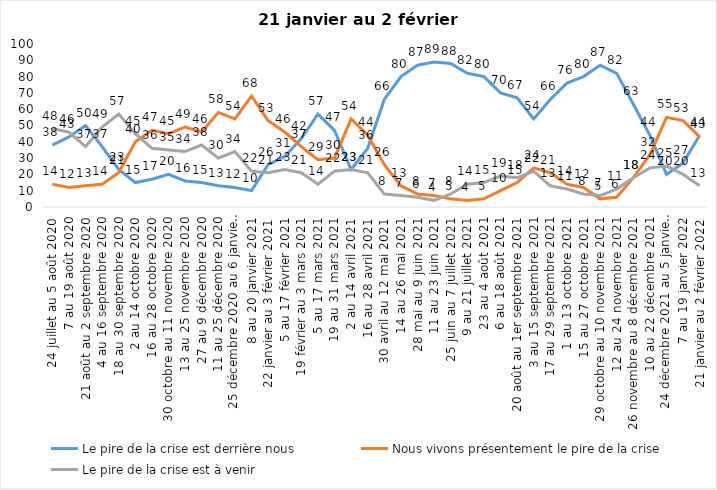
| Category | Le pire de la crise est derrière nous | Nous vivons présentement le pire de la crise | Le pire de la crise est à venir |
|---|---|---|---|
| 24 juillet au 5 août 2020 | 38 | 14 | 48 |
| 7 au 19 août 2020 | 43 | 12 | 46 |
| 21 août au 2 septembre 2020 | 50 | 13 | 37 |
| 4 au 16 septembre 2020 | 37 | 14 | 49 |
| 18 au 30 septembre 2020 | 23 | 21 | 57 |
| 2 au 14 octobre 2020 | 15 | 40 | 45 |
| 16 au 28 octobre 2020 | 17 | 47 | 36 |
| 30 octobre au 11 novembre 2020 | 20 | 45 | 35 |
| 13 au 25 novembre 2020 | 16 | 49 | 34 |
| 27 au 9 décembre 2020 | 15 | 46 | 38 |
| 11 au 25 décembre 2020 | 13 | 58 | 30 |
| 25 décembre 2020 au 6 janvier 2021 | 12 | 54 | 34 |
| 8 au 20 janvier 2021 | 10 | 68 | 22 |
| 22 janvier au 3 février 2021 | 26 | 53 | 21 |
| 5 au 17 février 2021 | 31 | 46 | 23 |
| 19 février au 3 mars 2021 | 42 | 37 | 21 |
| 5 au 17 mars 2021 | 57 | 29 | 14 |
| 19 au 31 mars 2021 | 47 | 30 | 22 |
| 2 au 14 avril 2021 | 23 | 54 | 23 |
| 16 au 28 avril 2021 | 36 | 44 | 21 |
| 30 avril au 12 mai 2021 | 66 | 26 | 8 |
| 14 au 26 mai 2021 | 80 | 13 | 7 |
| 28 mai au 9 juin 2021 | 87 | 8 | 6 |
| 11 au 23 juin 2021 | 89 | 7 | 4 |
| 25 juin au 7 juillet 2021 | 88 | 5 | 8 |
| 9 au 21 juillet 2021 | 82 | 4 | 14 |
| 23 au 4 août 2021 | 80 | 5 | 15 |
| 6 au 18 août 2021 | 70 | 10 | 19 |
| 20 août au 1er septembre 2021 | 67 | 15 | 18 |
| 3 au 15 septembre 2021 | 54 | 24 | 22 |
| 17 au 29 septembre 2021 | 66 | 21 | 13 |
| 1 au 13 octobre 2021 | 76 | 14 | 11 |
| 15 au 27 octobre 2021 | 80 | 12 | 8 |
| 29 octobre au 10 novembre 2021 | 87 | 5 | 7 |
| 12 au 24 novembre 2021 | 82 | 6 | 11 |
| 26 novembre au 8 décembre 2021 | 63 | 18 | 18 |
| 10 au 22 décembre 2021 | 44 | 32 | 24 |
| 24 décembre 2021 au 5 janvier 2022 2022 | 20 | 55 | 25 |
| 7 au 19 janvier 2022 | 27 | 53 | 20 |
| 21 janvier au 2 février 2022 | 44 | 43 | 13 |